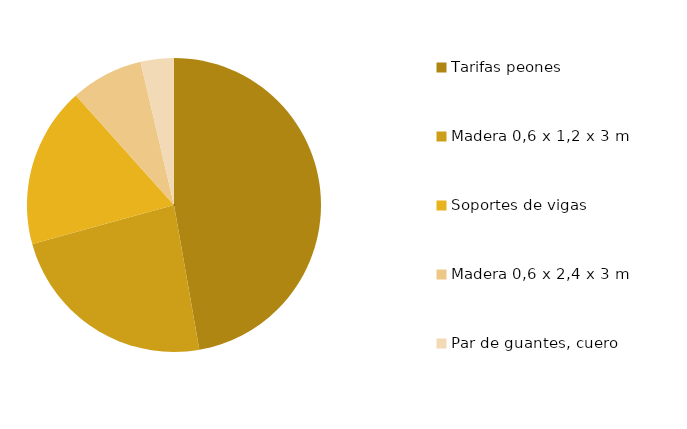
| Category | Series 0 |
|---|---|
| Tarifas peones | 200 |
| Madera 0,6 x 1,2 x 3 m | 99.4 |
| Soportes de vigas | 74.7 |
| Madera 0,6 x 2,4 x 3 m | 33.75 |
| Par de guantes, cuero | 15.5 |